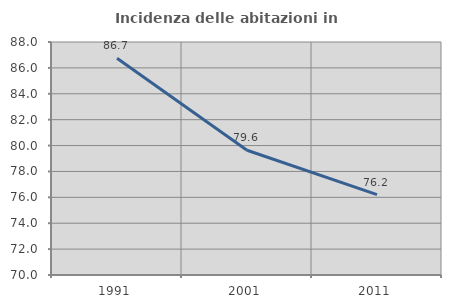
| Category | Incidenza delle abitazioni in proprietà  |
|---|---|
| 1991.0 | 86.747 |
| 2001.0 | 79.636 |
| 2011.0 | 76.214 |